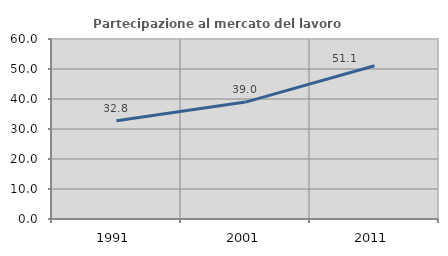
| Category | Partecipazione al mercato del lavoro  femminile |
|---|---|
| 1991.0 | 32.768 |
| 2001.0 | 38.974 |
| 2011.0 | 51.064 |